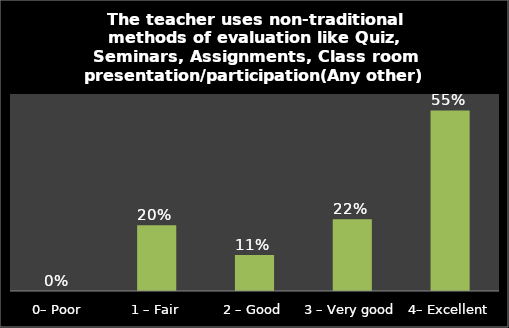
| Category | Series 0 |
|---|---|
| 0– Poor | 0 |
| 1 – Fair | 0.2 |
| 2 – Good | 0.11 |
| 3 – Very good | 0.219 |
| 4– Excellent | 0.55 |